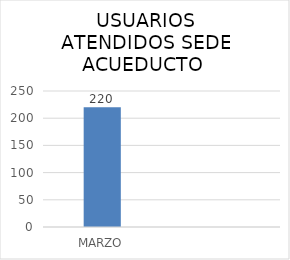
| Category | Series 0 |
|---|---|
| MARZO | 220 |